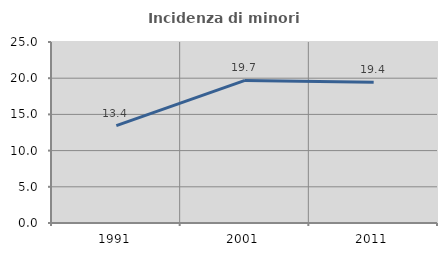
| Category | Incidenza di minori stranieri |
|---|---|
| 1991.0 | 13.443 |
| 2001.0 | 19.697 |
| 2011.0 | 19.45 |